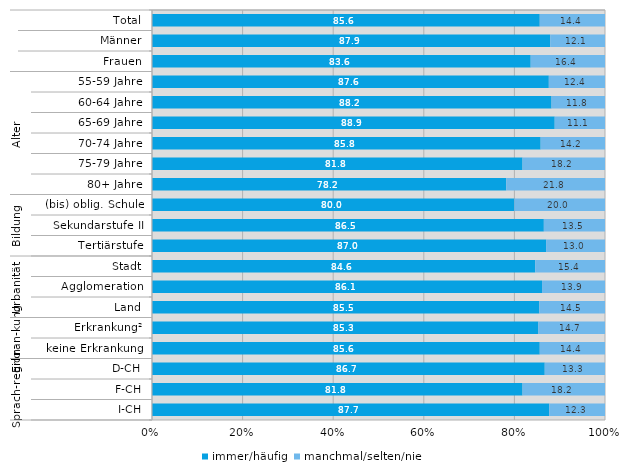
| Category | immer/häufig | manchmal/selten/nie |
|---|---|---|
| 0 | 85.6 | 14.4 |
| 1 | 87.9 | 12.1 |
| 2 | 83.6 | 16.4 |
| 3 | 87.6 | 12.4 |
| 4 | 88.2 | 11.8 |
| 5 | 88.9 | 11.1 |
| 6 | 85.8 | 14.2 |
| 7 | 81.8 | 18.2 |
| 8 | 78.2 | 21.8 |
| 9 | 80 | 20 |
| 10 | 86.5 | 13.5 |
| 11 | 87 | 13 |
| 12 | 84.6 | 15.4 |
| 13 | 86.1 | 13.9 |
| 14 | 85.5 | 14.5 |
| 15 | 85.3 | 14.7 |
| 16 | 85.6 | 14.4 |
| 17 | 86.7 | 13.3 |
| 18 | 81.8 | 18.2 |
| 19 | 87.7 | 12.3 |